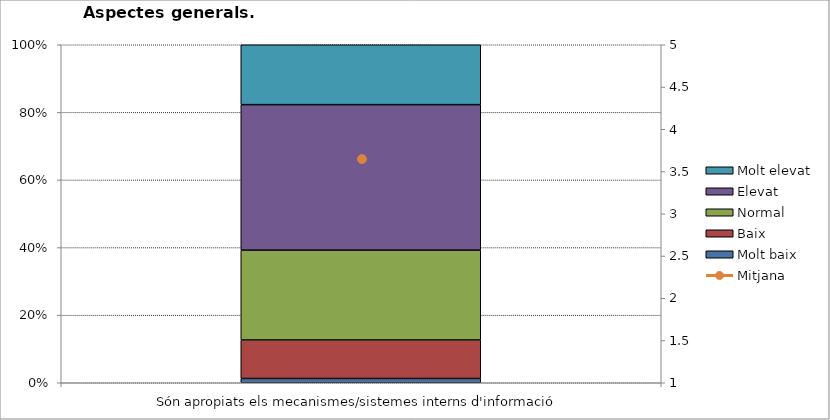
| Category | Molt baix | Baix | Normal  | Elevat | Molt elevat |
|---|---|---|---|---|---|
| Són apropiats els mecanismes/sistemes interns d'informació | 1 | 9 | 21 | 34 | 14 |